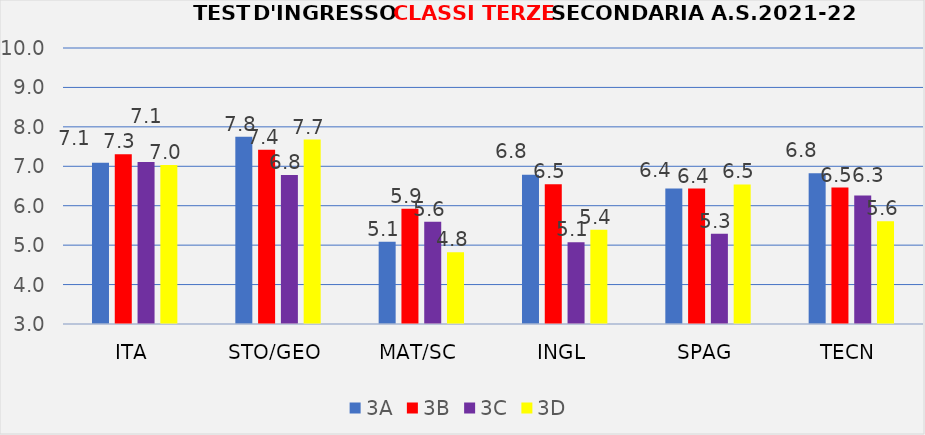
| Category | 3A | 3B | 3C | 3D |
|---|---|---|---|---|
| ITA | 7.087 | 7.308 | 7.111 | 7.036 |
| STO/GEO | 7.75 | 7.417 | 6.778 | 7.679 |
| MAT/SC | 5.087 | 5.923 | 5.593 | 4.821 |
| INGL | 6.783 | 6.542 | 5.071 | 5.393 |
| SPAG | 6.435 | 6.435 | 5.292 | 6.538 |
| TECN | 6.826 | 6.462 | 6.259 | 5.607 |